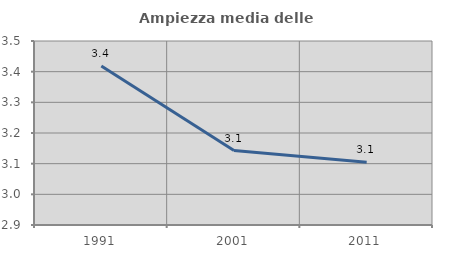
| Category | Ampiezza media delle famiglie |
|---|---|
| 1991.0 | 3.419 |
| 2001.0 | 3.143 |
| 2011.0 | 3.105 |